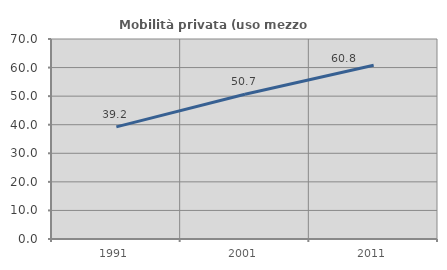
| Category | Mobilità privata (uso mezzo privato) |
|---|---|
| 1991.0 | 39.248 |
| 2001.0 | 50.667 |
| 2011.0 | 60.835 |